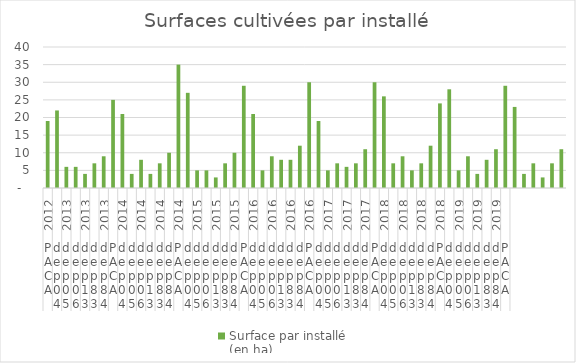
| Category | Surface par installé
(en ha) |
|---|---|
| 0 | 19 |
| 1 | 22 |
| 2 | 6 |
| 3 | 6 |
| 4 | 4 |
| 5 | 7 |
| 6 | 9 |
| 7 | 25 |
| 8 | 21 |
| 9 | 4 |
| 10 | 8 |
| 11 | 4 |
| 12 | 7 |
| 13 | 10 |
| 14 | 35 |
| 15 | 27 |
| 16 | 5 |
| 17 | 5 |
| 18 | 3 |
| 19 | 7 |
| 20 | 10 |
| 21 | 29 |
| 22 | 21 |
| 23 | 5 |
| 24 | 9 |
| 25 | 8 |
| 26 | 8 |
| 27 | 12 |
| 28 | 30 |
| 29 | 19 |
| 30 | 5 |
| 31 | 7 |
| 32 | 6 |
| 33 | 7 |
| 34 | 11 |
| 35 | 30 |
| 36 | 26 |
| 37 | 7 |
| 38 | 9 |
| 39 | 5 |
| 40 | 7 |
| 41 | 12 |
| 42 | 24 |
| 43 | 28 |
| 44 | 5 |
| 45 | 9 |
| 46 | 4 |
| 47 | 8 |
| 48 | 11 |
| 49 | 29 |
| 50 | 23 |
| 51 | 4 |
| 52 | 7 |
| 53 | 3 |
| 54 | 7 |
| 55 | 11 |